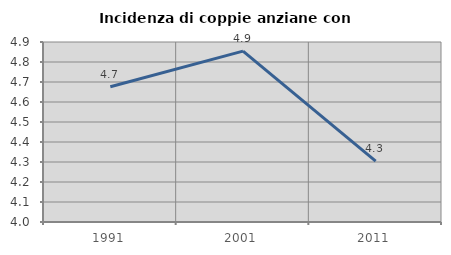
| Category | Incidenza di coppie anziane con figli |
|---|---|
| 1991.0 | 4.676 |
| 2001.0 | 4.854 |
| 2011.0 | 4.305 |